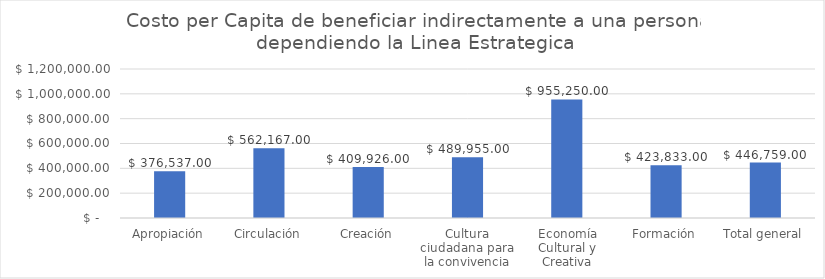
| Category | Promedio de Costo percapita beneficiario indirecto |
|---|---|
| Apropiación | 376537 |
| Circulación | 562167 |
| Creación | 409926 |
| Cultura ciudadana para la convivencia | 489955 |
| Economía Cultural y Creativa | 955250 |
| Formación | 423833 |
| Total general | 446759 |